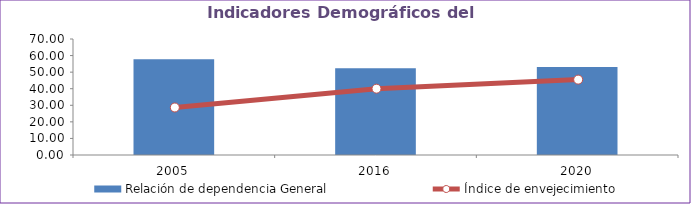
| Category | Relación de dependencia General |
|---|---|
| 2005.0 | 57.851 |
| 2016.0 | 52.315 |
| 2020.0 | 53.033 |